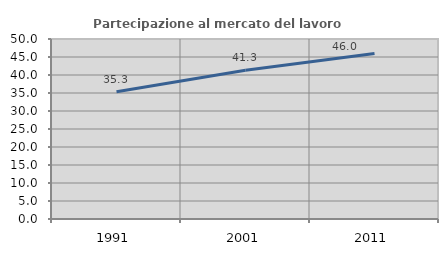
| Category | Partecipazione al mercato del lavoro  femminile |
|---|---|
| 1991.0 | 35.322 |
| 2001.0 | 41.337 |
| 2011.0 | 45.98 |